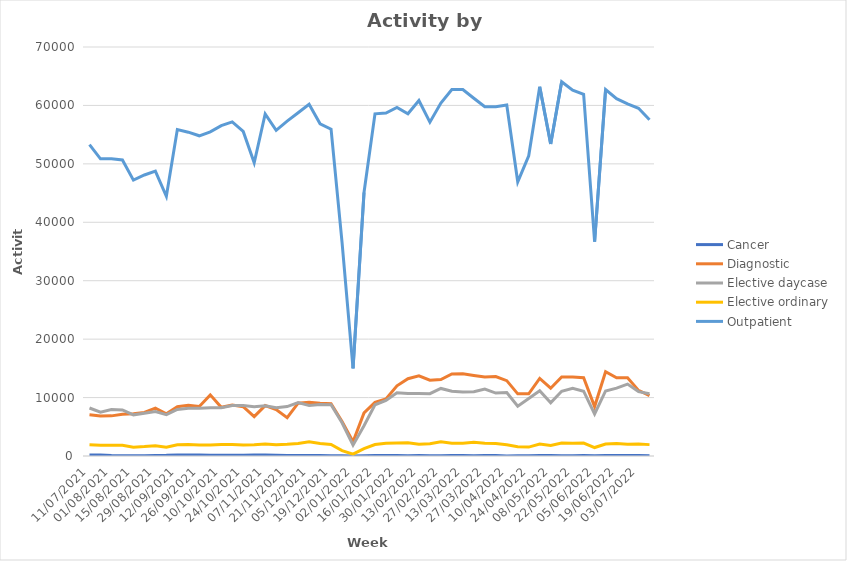
| Category | Cancer | Diagnostic | Elective daycase | Elective ordinary | Outpatient |
|---|---|---|---|---|---|
| 11/07/2021 | 151 | 7059 | 8217 | 1920 | 53294 |
| 18/07/2021 | 160 | 6855 | 7495 | 1825 | 50854 |
| 01/08/2021 | 72 | 6868 | 7945 | 1840 | 50870 |
| 08/08/2021 | 46 | 7153 | 7883 | 1850 | 50660 |
| 15/08/2021 | 50 | 7237 | 7043 | 1519 | 47214 |
| 22/08/2021 | 56 | 7450 | 7321 | 1611 | 48096 |
| 29/08/2021 | 98 | 8192 | 7605 | 1750 | 48760 |
| 05/09/2021 | 113 | 7215 | 7075 | 1487 | 44447 |
| 12/09/2021 | 180 | 8441 | 7972 | 1933 | 55870 |
| 19/09/2021 | 169 | 8672 | 8163 | 1948 | 55422 |
| 26/09/2021 | 177 | 8486 | 8189 | 1880 | 54803 |
| 03/10/2021 | 145 | 10463 | 8240 | 1875 | 55468 |
| 10/10/2021 | 120 | 8340 | 8244 | 1985 | 56545 |
| 17/10/2021 | 124 | 8705 | 8637 | 1971 | 57178 |
| 24/10/2021 | 125 | 8442 | 8622 | 1862 | 55541 |
| 31/10/2021 | 171 | 6734 | 8451 | 1930 | 50171 |
| 07/11/2021 | 176 | 8626 | 8605 | 2073 | 58552 |
| 14/11/2021 | 139 | 7940 | 8247 | 1919 | 55730 |
| 21/11/2021 | 83 | 6573 | 8462 | 1992 | 57315 |
| 28/11/2021 | 85 | 9048 | 9129 | 2129 | 58736 |
| 05/12/2021 | 80 | 9179 | 8649 | 2439 | 60182 |
| 12/12/2021 | 81 | 9008 | 8834 | 2127 | 56850 |
| 19/12/2021 | 55 | 8962 | 8770 | 1980 | 55935 |
| 26/12/2021 | 26 | 5891 | 5676 | 927 | 36561 |
| 02/01/2022 | 18 | 2429 | 1863 | 311 | 14996 |
| 09/01/2022 | 48 | 7371 | 5191 | 1265 | 45100 |
| 16/01/2022 | 77 | 9180 | 8767 | 1959 | 58555 |
| 23/01/2022 | 94 | 9772 | 9514 | 2186 | 58702 |
| 30/01/2022 | 70 | 12003 | 10804 | 2225 | 59641 |
| 06/02/2022 | 62 | 13231 | 10680 | 2278 | 58579 |
| 13/02/2022 | 69 | 13712 | 10713 | 2004 | 60836 |
| 20/02/2022 | 46 | 12967 | 10664 | 2107 | 57129 |
| 27/02/2022 | 23 | 13085 | 11565 | 2421 | 60410 |
| 06/03/2022 | 93 | 14033 | 11077 | 2186 | 62726 |
| 13/03/2022 | 87 | 14091 | 10947 | 2199 | 62721 |
| 20/03/2022 | 57 | 13784 | 10998 | 2333 | 61232 |
| 27/03/2022 | 79 | 13509 | 11447 | 2189 | 59781 |
| 03/04/2022 | 71 | 13599 | 10774 | 2152 | 59780 |
| 10/04/2022 | 19 | 12896 | 10873 | 1907 | 60075 |
| 17/04/2022 | 24 | 10636 | 8519 | 1598 | 46924 |
| 24/04/2022 | 33 | 10648 | 9828 | 1526 | 51371 |
| 01/05/2022 | 68 | 13277 | 11171 | 2049 | 63205 |
| 08/05/2022 | 66 | 11602 | 9100 | 1787 | 53415 |
| 15/05/2022 | 64 | 13516 | 11085 | 2218 | 64061 |
| 22/05/2022 | 61 | 13526 | 11606 | 2174 | 62615 |
| 29/05/2022 | 68 | 13409 | 11092 | 2207 | 61917 |
| 05/06/2022 | 33 | 8460 | 7194 | 1449 | 36685 |
| 12/06/2022 | 100 | 14427 | 11135 | 2061 | 62722 |
| 19/06/2022 | 76 | 13388 | 11620 | 2126 | 61167 |
| 26/06/2022 | 72 | 13409 | 12311 | 2021 | 60269 |
| 03/07/2022 | 65 | 11229 | 11022 | 2033 | 59511 |
| 10/07/2022 | 51 | 10336 | 10647 | 1947 | 57563 |